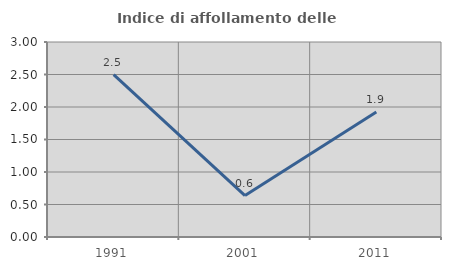
| Category | Indice di affollamento delle abitazioni  |
|---|---|
| 1991.0 | 2.497 |
| 2001.0 | 0.637 |
| 2011.0 | 1.923 |